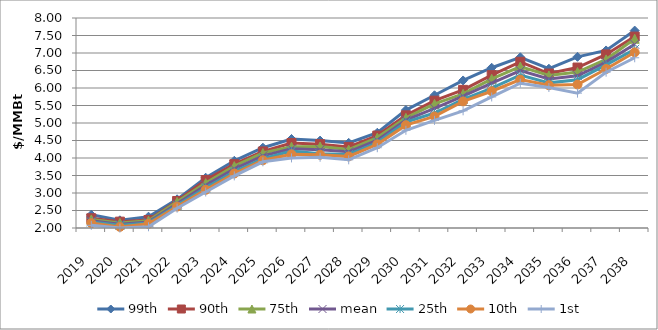
| Category | 99th | 90th | 75th | mean | 25th | 10th | 1st |
|---|---|---|---|---|---|---|---|
| 2019.0 | 2.378 | 2.278 | 2.246 | 2.21 | 2.173 | 2.141 | 2.076 |
| 2020.0 | 2.219 | 2.182 | 2.145 | 2.109 | 2.079 | 2.032 | 1.997 |
| 2021.0 | 2.323 | 2.227 | 2.209 | 2.174 | 2.144 | 2.12 | 2.035 |
| 2022.0 | 2.819 | 2.772 | 2.747 | 2.693 | 2.646 | 2.612 | 2.566 |
| 2023.0 | 3.437 | 3.369 | 3.283 | 3.22 | 3.148 | 3.092 | 3.029 |
| 2024.0 | 3.92 | 3.822 | 3.769 | 3.691 | 3.609 | 3.557 | 3.488 |
| 2025.0 | 4.294 | 4.187 | 4.141 | 4.063 | 3.978 | 3.935 | 3.891 |
| 2026.0 | 4.543 | 4.429 | 4.323 | 4.266 | 4.196 | 4.105 | 4.002 |
| 2027.0 | 4.497 | 4.396 | 4.329 | 4.235 | 4.121 | 4.093 | 4.021 |
| 2028.0 | 4.432 | 4.316 | 4.241 | 4.178 | 4.102 | 4.045 | 3.948 |
| 2029.0 | 4.721 | 4.641 | 4.584 | 4.507 | 4.442 | 4.391 | 4.294 |
| 2030.0 | 5.37 | 5.219 | 5.146 | 5.083 | 5.024 | 4.938 | 4.792 |
| 2031.0 | 5.792 | 5.638 | 5.546 | 5.419 | 5.285 | 5.189 | 5.076 |
| 2032.0 | 6.215 | 5.946 | 5.834 | 5.766 | 5.678 | 5.616 | 5.348 |
| 2033.0 | 6.578 | 6.367 | 6.262 | 6.137 | 5.998 | 5.908 | 5.744 |
| 2034.0 | 6.877 | 6.748 | 6.614 | 6.495 | 6.371 | 6.24 | 6.137 |
| 2035.0 | 6.551 | 6.414 | 6.358 | 6.256 | 6.147 | 6.08 | 6.015 |
| 2036.0 | 6.891 | 6.585 | 6.456 | 6.351 | 6.238 | 6.099 | 5.853 |
| 2037.0 | 7.073 | 6.959 | 6.817 | 6.739 | 6.66 | 6.544 | 6.452 |
| 2038.0 | 7.64 | 7.469 | 7.407 | 7.25 | 7.105 | 7.019 | 6.864 |